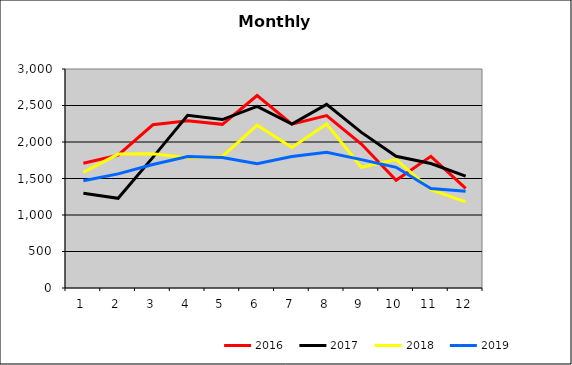
| Category | 2016 | 2017 | 2018 | 2019 |
|---|---|---|---|---|
| 0 | 1709.692 | 1297.347 | 1584.945 | 1467.961 |
| 1 | 1818.591 | 1228.546 | 1834.566 | 1563.301 |
| 2 | 2235.971 | 1789.782 | 1838.878 | 1692.17 |
| 3 | 2290.052 | 2364.914 | 1785.082 | 1799.954 |
| 4 | 2241.602 | 2307.576 | 1801.761 | 1787.008 |
| 5 | 2636.687 | 2488.575 | 2229.629 | 1700.928 |
| 6 | 2245.31 | 2244.746 | 1923.685 | 1800.379 |
| 7 | 2362.2 | 2515.952 | 2246.519 | 1860.378 |
| 8 | 1971.49 | 2131.972 | 1654.017 | 1758.729 |
| 9 | 1477.1 | 1804.009 | 1760.102 | 1653.423 |
| 10 | 1802.993 | 1705.861 | 1345.712 | 1362.688 |
| 11 | 1366.089 | 1533.212 | 1179.594 | 1326.915 |